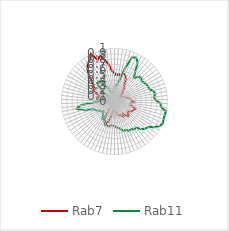
| Category | Rab7 | Rab11 |
|---|---|---|
| 0.0 | 0.536 | 0.202 |
| 0.10913 | 0.495 | 0.278 |
| 0.21825 | 0.527 | 0.324 |
| 0.32738 | 0.501 | 0.42 |
| 0.43651 | 0.557 | 0.661 |
| 0.54563 | 0.537 | 0.899 |
| 0.65476 | 0.479 | 0.924 |
| 0.76389 | 0.357 | 0.852 |
| 0.87302 | 0.323 | 0.677 |
| 0.98214 | 0.243 | 0.574 |
| 1.09127 | 0.227 | 0.642 |
| 1.2004 | 0.123 | 0.676 |
| 1.30952 | 0.175 | 0.643 |
| 1.41865 | 0.137 | 0.658 |
| 1.52778 | 0.19 | 0.679 |
| 1.6369 | 0.207 | 0.695 |
| 1.74603 | 0.214 | 0.695 |
| 1.85516 | 0.254 | 0.755 |
| 1.96429 | 0.299 | 0.781 |
| 2.07341 | 0.319 | 0.748 |
| 2.18254 | 0.328 | 0.77 |
| 2.29167 | 0.369 | 0.864 |
| 2.40079 | 0.311 | 0.884 |
| 2.50992 | 0.296 | 0.988 |
| 2.61905 | 0.354 | 0.98 |
| 2.72817 | 0.42 | 0.984 |
| 2.8373 | 0.398 | 1 |
| 2.94643 | 0.373 | 0.97 |
| 3.05556 | 0.346 | 0.89 |
| 3.16468 | 0.313 | 0.797 |
| 3.27381 | 0.311 | 0.773 |
| 3.38294 | 0.38 | 0.724 |
| 3.49206 | 0.338 | 0.637 |
| 3.60119 | 0.283 | 0.645 |
| 3.71032 | 0.33 | 0.604 |
| 3.81944 | 0.3 | 0.622 |
| 3.92857 | 0.275 | 0.576 |
| 4.0377 | 0.269 | 0.581 |
| 4.14683 | 0.253 | 0.539 |
| 4.25595 | 0.264 | 0.506 |
| 4.36508 | 0.195 | 0.489 |
| 4.47421 | 0.175 | 0.461 |
| 4.58333 | 0.157 | 0.456 |
| 4.69246 | 0.165 | 0.452 |
| 4.80159 | 0.302 | 0.483 |
| 4.91071 | 0.405 | 0.477 |
| 5.01984 | 0.469 | 0.466 |
| 5.12897 | 0.422 | 0.411 |
| 5.2381 | 0.394 | 0.336 |
| 5.34722 | 0.167 | 0.395 |
| 5.45635 | 0.075 | 0.342 |
| 5.56548 | 0.076 | 0.311 |
| 5.6746 | 0.08 | 0.272 |
| 5.78373 | 0.076 | 0.309 |
| 5.89286 | 0.054 | 0.328 |
| 6.00198 | 0.029 | 0.334 |
| 6.11111 | 0.01 | 0.398 |
| 6.22024 | 0.033 | 0.436 |
| 6.32937 | 0.076 | 0.611 |
| 6.43849 | 0 | 0.727 |
| 6.54762 | 0.059 | 0.648 |
| 6.65675 | 0.136 | 0.367 |
| 6.76587 | 0.128 | 0.286 |
| 6.875 | 0.24 | 0.126 |
| 6.98413 | 0.33 | 0.045 |
| 7.09325 | 0.337 | 0.033 |
| 7.20238 | 0.298 | 0 |
| 7.31151 | 0.377 | 0.015 |
| 7.42063 | 0.46 | 0.043 |
| 7.52976 | 0.439 | 0.09 |
| 7.63889 | 0.496 | 0.172 |
| 7.74802 | 0.574 | 0.34 |
| 7.85714 | 0.706 | 0.456 |
| 7.96627 | 0.802 | 0.484 |
| 8.0754 | 0.879 | 0.44 |
| 8.18452 | 0.903 | 0.367 |
| 8.29365 | 1 | 0.297 |
| 8.40278 | 0.847 | 0.222 |
| 8.5119 | 0.907 | 0.182 |
| 8.62103 | 0.807 | 0.19 |
| 8.73016 | 0.708 | 0.146 |
| 8.83929 | 0.575 | 0.129 |